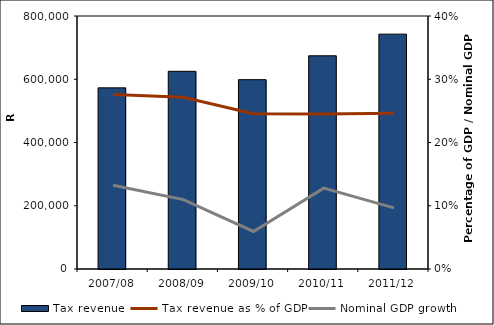
| Category | Tax revenue |
|---|---|
| 2007/08 | 572814.52 |
| 2008/09 | 625100.165 |
| 2009/10 | 598705.444 |
| 2010/11 | 674183.146 |
| 2011/12 | 742649.713 |